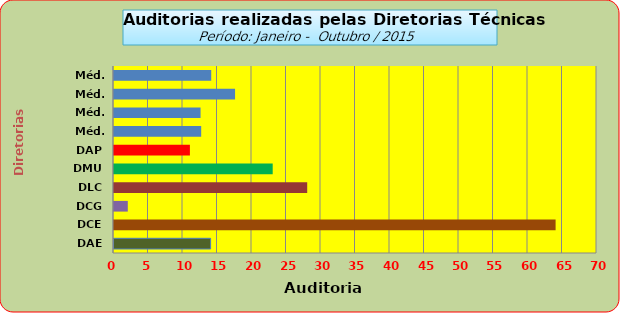
| Category | Series 0 |
|---|---|
| DAE | 14 |
| DCE | 64 |
| DCG | 2 |
| DLC | 28 |
| DMU | 23 |
| DAP | 11 |
| Méd. 2011 | 12.636 |
| Méd. 2012 | 12.545 |
| Méd. 2013 | 17.545 |
| Méd. 2014 | 14.091 |